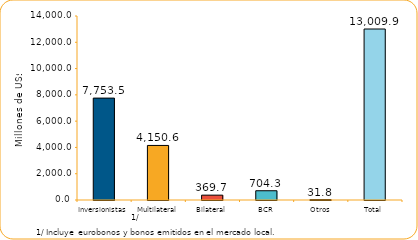
| Category | Series 1 |
|---|---|
| Inversionistas | 7753.5 |
| Multilateral | 4150.6 |
| Bilateral | 369.7 |
| BCR | 704.3 |
| Otros | 31.8 |
| Total | 13009.9 |